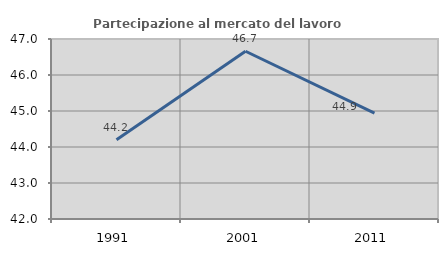
| Category | Partecipazione al mercato del lavoro  femminile |
|---|---|
| 1991.0 | 44.203 |
| 2001.0 | 46.66 |
| 2011.0 | 44.943 |